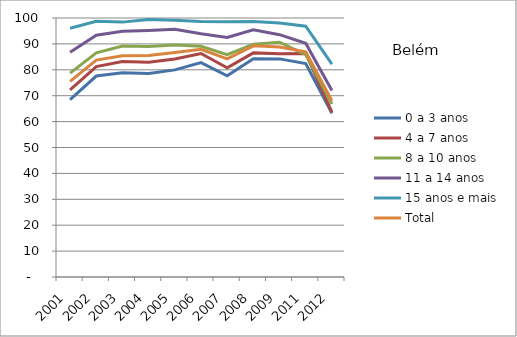
| Category | 0 a 3 anos | 4 a 7 anos | 8 a 10 anos | 11 a 14 anos | 15 anos e mais | Total |
|---|---|---|---|---|---|---|
| 2001.0 | 68.49 | 72.29 | 78.74 | 86.79 | 96.05 | 75.54 |
| 2002.0 | 77.59 | 81.26 | 86.58 | 93.35 | 98.71 | 83.75 |
| 2003.0 | 78.84 | 83.23 | 89.21 | 94.84 | 98.41 | 85.39 |
| 2004.0 | 78.54 | 82.96 | 88.99 | 95.15 | 99.41 | 85.5 |
| 2005.0 | 79.96 | 84.15 | 89.62 | 95.63 | 99.11 | 86.71 |
| 2006.0 | 82.8 | 86.29 | 89.07 | 93.91 | 98.66 | 87.89 |
| 2007.0 | 77.7 | 80.81 | 85.83 | 92.49 | 98.56 | 84.22 |
| 2008.0 | 84.31 | 86.53 | 89.92 | 95.46 | 98.66 | 89.24 |
| 2009.0 | 84.21 | 86.18 | 90.65 | 93.57 | 98.08 | 88.81 |
| 2011.0 | 82.39 | 86.31 | 85.85 | 90.22 | 96.82 | 86.98 |
| 2012.0 | 63.23 | 63.7 | 66.79 | 72.04 | 82.16 | 68.03 |